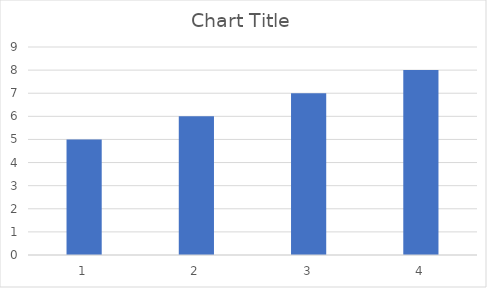
| Category | Series 0 |
|---|---|
| 0 | 5 |
| 1 | 6 |
| 2 | 7 |
| 3 | 8 |